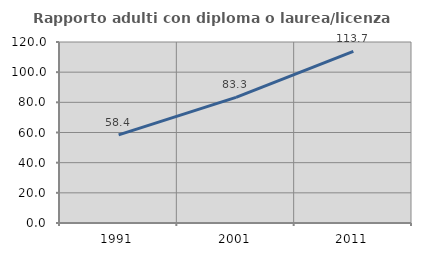
| Category | Rapporto adulti con diploma o laurea/licenza media  |
|---|---|
| 1991.0 | 58.385 |
| 2001.0 | 83.333 |
| 2011.0 | 113.725 |